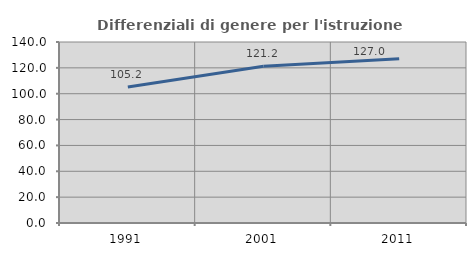
| Category | Differenziali di genere per l'istruzione superiore |
|---|---|
| 1991.0 | 105.181 |
| 2001.0 | 121.201 |
| 2011.0 | 126.994 |